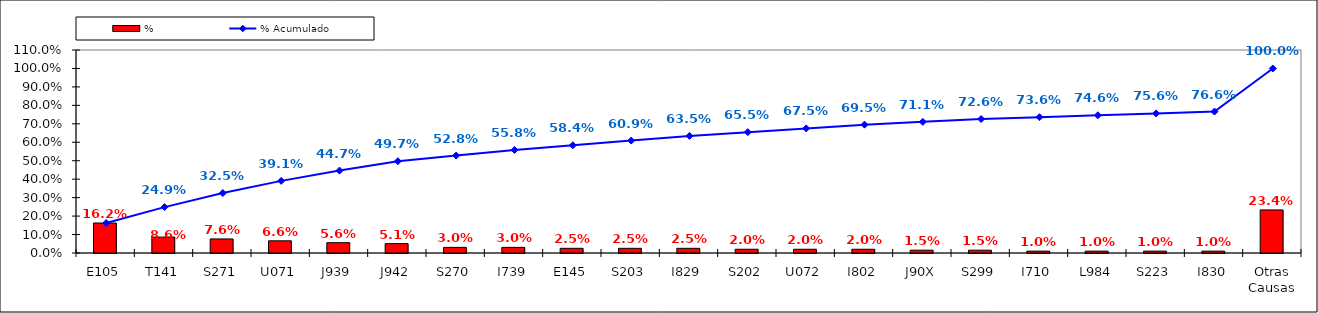
| Category | % |
|---|---|
| E105 | 0.162 |
| T141 | 0.086 |
| S271 | 0.076 |
| U071 | 0.066 |
| J939 | 0.056 |
| J942 | 0.051 |
| S270 | 0.03 |
| I739 | 0.03 |
| E145 | 0.025 |
| S203 | 0.025 |
| I829 | 0.025 |
| S202 | 0.02 |
| U072 | 0.02 |
| I802 | 0.02 |
| J90X | 0.015 |
| S299 | 0.015 |
| I710 | 0.01 |
| L984 | 0.01 |
| S223 | 0.01 |
| I830 | 0.01 |
| Otras Causas | 0.234 |